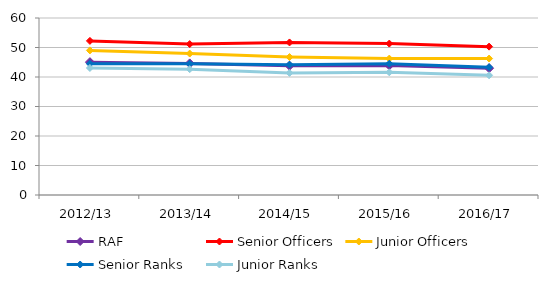
| Category | RAF | Senior Officers | Junior Officers | Senior Ranks | Junior Ranks |
|---|---|---|---|---|---|
| 2012/13 | 45.039 | 52.242 | 49.017 | 44.481 | 43.061 |
| 2013/14 | 44.609 | 51.161 | 47.949 | 44.48 | 42.656 |
| 2014/15 | 43.826 | 51.711 | 46.761 | 44.187 | 41.39 |
| 2015/16 | 43.935 | 51.331 | 46.234 | 44.513 | 41.592 |
| 2016/17 | 42.993 | 50.294 | 46.252 | 43.331 | 40.571 |